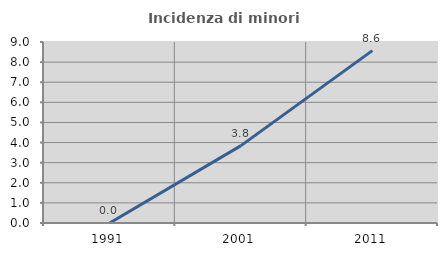
| Category | Incidenza di minori stranieri |
|---|---|
| 1991.0 | 0 |
| 2001.0 | 3.846 |
| 2011.0 | 8.571 |